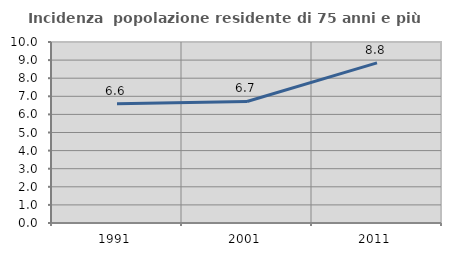
| Category | Incidenza  popolazione residente di 75 anni e più |
|---|---|
| 1991.0 | 6.586 |
| 2001.0 | 6.716 |
| 2011.0 | 8.846 |